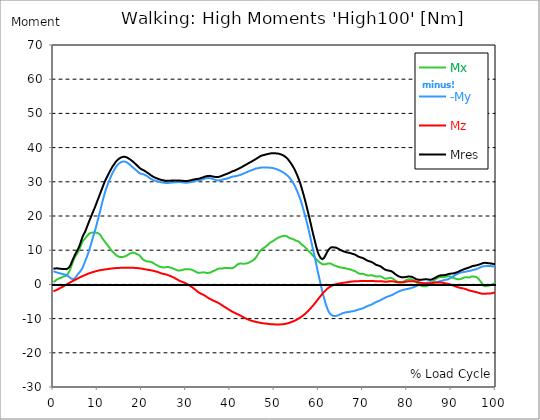
| Category |  Mx |  -My |  Mz |  Mres |
|---|---|---|---|---|
| 0.0 | 0.75 | 3.824 | -1.977 | 4.649 |
| 0.167348456675344 | 0.804 | 3.748 | -1.923 | 4.617 |
| 0.334696913350688 | 0.902 | 3.693 | -1.847 | 4.617 |
| 0.5020453700260321 | 1.097 | 3.617 | -1.76 | 4.66 |
| 0.669393826701376 | 1.325 | 3.541 | -1.662 | 4.704 |
| 0.83674228337672 | 1.423 | 3.465 | -1.564 | 4.671 |
| 1.0040907400520642 | 1.564 | 3.411 | -1.445 | 4.671 |
| 1.1621420602454444 | 1.684 | 3.346 | -1.325 | 4.66 |
| 1.3294905169207885 | 1.781 | 3.291 | -1.206 | 4.617 |
| 1.4968389735961325 | 1.858 | 3.248 | -1.097 | 4.595 |
| 1.6641874302714765 | 1.923 | 3.194 | -0.999 | 4.562 |
| 1.8315358869468206 | 1.988 | 3.128 | -0.891 | 4.53 |
| 1.9988843436221646 | 2.107 | 3.063 | -0.771 | 4.519 |
| 2.1662328002975086 | 2.216 | 3.009 | -0.663 | 4.53 |
| 2.333581256972853 | 2.335 | 2.944 | -0.532 | 4.53 |
| 2.5009297136481967 | 2.422 | 2.9 | -0.391 | 4.53 |
| 2.6682781703235405 | 2.433 | 2.868 | -0.272 | 4.486 |
| 2.8356266269988843 | 2.422 | 2.813 | -0.141 | 4.432 |
| 3.002975083674229 | 2.596 | 2.716 | -0.022 | 4.465 |
| 3.1703235403495724 | 2.889 | 2.585 | 0.098 | 4.628 |
| 3.337671997024917 | 3.172 | 2.422 | 0.239 | 4.736 |
| 3.4957233172182973 | 3.52 | 2.259 | 0.369 | 4.899 |
| 3.663071773893641 | 3.976 | 2.097 | 0.478 | 5.192 |
| 3.8304202305689854 | 4.497 | 1.955 | 0.597 | 5.562 |
| 3.997768687244329 | 5.073 | 1.771 | 0.706 | 6.029 |
| 4.165117143919673 | 5.681 | 1.553 | 0.815 | 6.507 |
| 4.332465600595017 | 6.311 | 1.51 | 0.945 | 7.061 |
| 4.499814057270361 | 6.887 | 1.51 | 1.065 | 7.571 |
| 4.667162513945706 | 7.354 | 1.619 | 1.184 | 8.028 |
| 4.834510970621049 | 7.843 | 1.727 | 1.282 | 8.506 |
| 5.001859427296393 | 8.256 | 1.977 | 1.401 | 8.94 |
| 5.169207883971737 | 8.614 | 2.259 | 1.51 | 9.342 |
| 5.336556340647081 | 8.918 | 2.596 | 1.619 | 9.722 |
| 5.503904797322425 | 9.288 | 2.922 | 1.727 | 10.135 |
| 5.671253253997769 | 9.668 | 3.205 | 1.836 | 10.569 |
| 5.82930457419115 | 10.124 | 3.422 | 1.944 | 11.069 |
| 5.996653030866494 | 10.624 | 3.672 | 2.064 | 11.634 |
| 6.164001487541838 | 11.167 | 3.954 | 2.173 | 12.275 |
| 6.331349944217181 | 11.732 | 4.236 | 2.281 | 12.916 |
| 6.498698400892526 | 12.275 | 4.595 | 2.368 | 13.557 |
| 6.66604685756787 | 12.688 | 5.062 | 2.466 | 14.111 |
| 6.833395314243213 | 12.927 | 5.616 | 2.564 | 14.567 |
| 7.000743770918558 | 13.144 | 6.159 | 2.651 | 14.969 |
| 7.168092227593902 | 13.339 | 6.702 | 2.737 | 15.36 |
| 7.335440684269246 | 13.687 | 7.224 | 2.835 | 15.914 |
| 7.50278914094459 | 13.959 | 7.789 | 2.922 | 16.457 |
| 7.6701375976199335 | 14.198 | 8.375 | 3.02 | 17.011 |
| 7.837486054295278 | 14.491 | 8.973 | 3.107 | 17.598 |
| 7.995537374488658 | 14.741 | 9.592 | 3.194 | 18.163 |
| 8.162885831164003 | 14.915 | 10.265 | 3.27 | 18.706 |
| 8.330234287839346 | 15.001 | 10.982 | 3.346 | 19.227 |
| 8.49758274451469 | 15.078 | 11.721 | 3.411 | 19.738 |
| 8.664931201190035 | 15.143 | 12.481 | 3.487 | 20.27 |
| 8.832279657865378 | 15.143 | 13.22 | 3.563 | 20.791 |
| 8.999628114540721 | 15.11 | 13.98 | 3.628 | 21.324 |
| 9.166976571216066 | 15.164 | 14.676 | 3.693 | 21.856 |
| 9.334325027891412 | 15.164 | 15.371 | 3.748 | 22.345 |
| 9.501673484566755 | 15.186 | 16.12 | 3.813 | 22.899 |
| 9.669021941242098 | 15.175 | 16.902 | 3.878 | 23.464 |
| 9.836370397917442 | 15.099 | 17.75 | 3.932 | 24.039 |
| 10.003718854592787 | 15.045 | 18.575 | 3.987 | 24.615 |
| 10.17106731126813 | 14.925 | 19.39 | 4.041 | 25.158 |
| 10.329118631461512 | 14.806 | 20.237 | 4.084 | 25.734 |
| 10.496467088136853 | 14.621 | 21.074 | 4.128 | 26.299 |
| 10.663815544812199 | 14.382 | 21.91 | 4.171 | 26.853 |
| 10.831164001487544 | 14.046 | 22.801 | 4.204 | 27.418 |
| 10.998512458162887 | 13.665 | 23.713 | 4.236 | 27.993 |
| 11.16586091483823 | 13.339 | 24.539 | 4.258 | 28.558 |
| 11.333209371513574 | 13.035 | 25.354 | 4.302 | 29.101 |
| 11.50055782818892 | 12.742 | 26.136 | 4.334 | 29.634 |
| 11.667906284864264 | 12.438 | 26.885 | 4.367 | 30.166 |
| 11.835254741539607 | 12.155 | 27.57 | 4.399 | 30.655 |
| 12.00260319821495 | 11.884 | 28.189 | 4.432 | 31.1 |
| 12.169951654890292 | 11.623 | 28.775 | 4.454 | 31.535 |
| 12.337300111565641 | 11.341 | 29.362 | 4.486 | 31.969 |
| 12.504648568240984 | 11.047 | 29.916 | 4.53 | 32.393 |
| 12.662699888434362 | 10.754 | 30.459 | 4.551 | 32.795 |
| 12.830048345109708 | 10.461 | 31.002 | 4.584 | 33.207 |
| 12.997396801785053 | 10.168 | 31.524 | 4.617 | 33.599 |
| 13.164745258460396 | 9.896 | 32.013 | 4.649 | 33.979 |
| 13.33209371513574 | 9.624 | 32.491 | 4.671 | 34.37 |
| 13.499442171811083 | 9.429 | 32.871 | 4.693 | 34.685 |
| 13.666790628486426 | 9.233 | 33.24 | 4.714 | 34.989 |
| 13.834139085161771 | 8.994 | 33.664 | 4.725 | 35.326 |
| 14.001487541837117 | 8.777 | 34.055 | 4.747 | 35.652 |
| 14.16883599851246 | 8.582 | 34.402 | 4.769 | 35.934 |
| 14.336184455187803 | 8.419 | 34.685 | 4.79 | 36.173 |
| 14.503532911863147 | 8.288 | 34.913 | 4.801 | 36.369 |
| 14.670881368538492 | 8.18 | 35.13 | 4.812 | 36.553 |
| 14.828932688731873 | 8.082 | 35.337 | 4.823 | 36.727 |
| 14.996281145407215 | 8.017 | 35.51 | 4.834 | 36.89 |
| 15.163629602082558 | 7.995 | 35.652 | 4.845 | 37.009 |
| 15.330978058757903 | 8.006 | 35.749 | 4.845 | 37.118 |
| 15.498326515433247 | 8.006 | 35.836 | 4.856 | 37.194 |
| 15.665674972108594 | 8.028 | 35.901 | 4.856 | 37.259 |
| 15.833023428783937 | 8.06 | 35.934 | 4.867 | 37.314 |
| 16.00037188545928 | 8.114 | 35.934 | 4.867 | 37.324 |
| 16.167720342134626 | 8.18 | 35.891 | 4.867 | 37.292 |
| 16.335068798809967 | 8.256 | 35.847 | 4.867 | 37.259 |
| 16.502417255485312 | 8.353 | 35.749 | 4.856 | 37.194 |
| 16.669765712160658 | 8.484 | 35.619 | 4.856 | 37.085 |
| 16.837114168836 | 8.625 | 35.467 | 4.867 | 36.977 |
| 17.004462625511344 | 8.766 | 35.304 | 4.867 | 36.846 |
| 17.16251394570472 | 8.897 | 35.152 | 4.867 | 36.727 |
| 17.32986240238007 | 9.038 | 34.946 | 4.867 | 36.564 |
| 17.497210859055414 | 9.125 | 34.75 | 4.867 | 36.39 |
| 17.664559315730756 | 9.201 | 34.554 | 4.867 | 36.227 |
| 17.8319077724061 | 9.288 | 34.37 | 4.856 | 36.064 |
| 17.999256229081443 | 9.32 | 34.196 | 4.856 | 35.912 |
| 18.166604685756788 | 9.266 | 34 | 4.845 | 35.717 |
| 18.333953142432133 | 9.212 | 33.783 | 4.834 | 35.489 |
| 18.501301599107478 | 9.103 | 33.609 | 4.812 | 35.282 |
| 18.668650055782823 | 9.016 | 33.468 | 4.79 | 35.119 |
| 18.835998512458165 | 8.918 | 33.262 | 4.78 | 34.902 |
| 19.00334696913351 | 8.81 | 33.066 | 4.758 | 34.674 |
| 19.170695425808855 | 8.723 | 32.86 | 4.747 | 34.457 |
| 19.338043882484197 | 8.625 | 32.664 | 4.736 | 34.25 |
| 19.496095202677576 | 8.44 | 32.501 | 4.704 | 34.044 |
| 19.66344365935292 | 8.201 | 32.393 | 4.671 | 33.881 |
| 19.830792116028263 | 7.952 | 32.349 | 4.638 | 33.751 |
| 19.998140572703612 | 7.637 | 32.306 | 4.595 | 33.609 |
| 20.165489029378953 | 7.354 | 32.273 | 4.573 | 33.501 |
| 20.3328374860543 | 7.191 | 32.23 | 4.53 | 33.414 |
| 20.500185942729644 | 7.083 | 32.143 | 4.486 | 33.294 |
| 20.667534399404985 | 6.974 | 32.045 | 4.432 | 33.175 |
| 20.83488285608033 | 6.865 | 31.926 | 4.389 | 33.034 |
| 21.002231312755672 | 6.767 | 31.817 | 4.356 | 32.892 |
| 21.16957976943102 | 6.702 | 31.687 | 4.302 | 32.751 |
| 21.336928226106362 | 6.691 | 31.524 | 4.269 | 32.599 |
| 21.504276682781704 | 6.702 | 31.361 | 4.247 | 32.436 |
| 21.67162513945705 | 6.67 | 31.241 | 4.226 | 32.306 |
| 21.82967645965043 | 6.648 | 31.067 | 4.193 | 32.132 |
| 21.997024916325774 | 6.605 | 30.915 | 4.139 | 31.969 |
| 22.16437337300112 | 6.539 | 30.763 | 4.095 | 31.806 |
| 22.33172182967646 | 6.463 | 30.655 | 4.063 | 31.676 |
| 22.499070286351806 | 6.322 | 30.535 | 4.019 | 31.524 |
| 22.666418743027148 | 6.192 | 30.448 | 3.965 | 31.415 |
| 22.833767199702496 | 6.051 | 30.361 | 3.9 | 31.296 |
| 23.00111565637784 | 5.877 | 30.318 | 3.835 | 31.209 |
| 23.168464113053183 | 5.736 | 30.275 | 3.769 | 31.122 |
| 23.335812569728528 | 5.649 | 30.209 | 3.715 | 31.046 |
| 23.50316102640387 | 5.54 | 30.144 | 3.672 | 30.948 |
| 23.670509483079215 | 5.431 | 30.09 | 3.606 | 30.872 |
| 23.83785793975456 | 5.312 | 30.036 | 3.53 | 30.785 |
| 23.995909259947936 | 5.203 | 29.992 | 3.433 | 30.72 |
| 24.163257716623285 | 5.116 | 29.949 | 3.335 | 30.655 |
| 24.330606173298627 | 5.073 | 29.883 | 3.248 | 30.568 |
| 24.49795462997397 | 5.029 | 29.829 | 3.172 | 30.513 |
| 24.665303086649313 | 4.986 | 29.797 | 3.118 | 30.459 |
| 24.83265154332466 | 4.964 | 29.764 | 3.096 | 30.427 |
| 25.0 | 4.953 | 29.753 | 3.052 | 30.405 |
| 25.167348456675345 | 4.986 | 29.71 | 2.998 | 30.361 |
| 25.334696913350694 | 5.019 | 29.644 | 2.955 | 30.318 |
| 25.502045370026035 | 5.051 | 29.634 | 2.9 | 30.307 |
| 25.669393826701377 | 5.095 | 29.634 | 2.835 | 30.307 |
| 25.836742283376722 | 5.105 | 29.655 | 2.759 | 30.329 |
| 26.004090740052067 | 5.084 | 29.666 | 2.672 | 30.318 |
| 26.17143919672741 | 5.029 | 29.699 | 2.596 | 30.34 |
| 26.329490516920792 | 4.975 | 29.71 | 2.52 | 30.329 |
| 26.49683897359613 | 4.921 | 29.731 | 2.433 | 30.34 |
| 26.66418743027148 | 4.845 | 29.753 | 2.335 | 30.351 |
| 26.831535886946828 | 4.758 | 29.786 | 2.238 | 30.361 |
| 26.998884343622166 | 4.682 | 29.807 | 2.14 | 30.361 |
| 27.166232800297514 | 4.617 | 29.829 | 2.042 | 30.372 |
| 27.333581256972852 | 4.519 | 29.862 | 1.934 | 30.372 |
| 27.5009297136482 | 4.432 | 29.883 | 1.814 | 30.372 |
| 27.668278170323543 | 4.313 | 29.873 | 1.684 | 30.351 |
| 27.835626626998888 | 4.204 | 29.873 | 1.553 | 30.34 |
| 28.002975083674233 | 4.128 | 29.883 | 1.434 | 30.34 |
| 28.170323540349575 | 4.074 | 29.916 | 1.314 | 30.361 |
| 28.33767199702492 | 4.03 | 29.938 | 1.195 | 30.372 |
| 28.50502045370026 | 4.019 | 29.938 | 1.086 | 30.361 |
| 28.663071773893645 | 4.052 | 29.927 | 0.978 | 30.351 |
| 28.830420230568986 | 4.117 | 29.894 | 0.88 | 30.329 |
| 28.99776868724433 | 4.182 | 29.862 | 0.793 | 30.318 |
| 29.165117143919673 | 4.247 | 29.84 | 0.717 | 30.296 |
| 29.33246560059502 | 4.302 | 29.807 | 0.641 | 30.275 |
| 29.499814057270367 | 4.356 | 29.775 | 0.554 | 30.253 |
| 29.66716251394571 | 4.399 | 29.753 | 0.467 | 30.242 |
| 29.834510970621054 | 4.432 | 29.742 | 0.38 | 30.231 |
| 30.00185942729639 | 4.454 | 29.731 | 0.272 | 30.22 |
| 30.169207883971744 | 4.443 | 29.742 | 0.163 | 30.231 |
| 30.33655634064708 | 4.432 | 29.764 | 0.043 | 30.253 |
| 30.50390479732243 | 4.421 | 29.786 | -0.098 | 30.275 |
| 30.671253253997772 | 4.432 | 29.818 | -0.228 | 30.318 |
| 30.829304574191156 | 4.41 | 29.862 | -0.358 | 30.372 |
| 30.996653030866494 | 4.389 | 29.916 | -0.489 | 30.427 |
| 31.164001487541842 | 4.313 | 29.959 | -0.641 | 30.47 |
| 31.331349944217187 | 4.236 | 30.036 | -0.782 | 30.524 |
| 31.498698400892525 | 4.15 | 30.101 | -0.945 | 30.59 |
| 31.666046857567874 | 4.063 | 30.166 | -1.108 | 30.644 |
| 31.833395314243212 | 3.965 | 30.22 | -1.271 | 30.698 |
| 32.00074377091856 | 3.867 | 30.253 | -1.445 | 30.72 |
| 32.1680922275939 | 3.759 | 30.307 | -1.619 | 30.774 |
| 32.33544068426925 | 3.585 | 30.361 | -1.792 | 30.839 |
| 32.50278914094459 | 3.476 | 30.361 | -1.977 | 30.85 |
| 32.670137597619934 | 3.433 | 30.34 | -2.162 | 30.85 |
| 32.83748605429528 | 3.4 | 30.34 | -2.314 | 30.85 |
| 33.004834510970625 | 3.411 | 30.394 | -2.455 | 30.915 |
| 33.162885831164004 | 3.411 | 30.492 | -2.574 | 31.013 |
| 33.33023428783935 | 3.443 | 30.568 | -2.694 | 31.089 |
| 33.497582744514695 | 3.465 | 30.611 | -2.803 | 31.144 |
| 33.664931201190036 | 3.498 | 30.666 | -2.9 | 31.209 |
| 33.83227965786538 | 3.53 | 30.731 | -3.009 | 31.274 |
| 33.99962811454073 | 3.53 | 30.829 | -3.107 | 31.372 |
| 34.16697657121607 | 3.487 | 30.926 | -3.226 | 31.469 |
| 34.33432502789141 | 3.433 | 31.002 | -3.357 | 31.545 |
| 34.50167348456676 | 3.389 | 31.057 | -3.487 | 31.6 |
| 34.6690219412421 | 3.367 | 31.067 | -3.65 | 31.643 |
| 34.83637039791744 | 3.378 | 31.078 | -3.791 | 31.665 |
| 35.00371885459279 | 3.367 | 31.089 | -3.932 | 31.698 |
| 35.17106731126814 | 3.367 | 31.089 | -4.063 | 31.708 |
| 35.338415767943474 | 3.389 | 31.1 | -4.193 | 31.741 |
| 35.49646708813686 | 3.454 | 31.057 | -4.313 | 31.719 |
| 35.6638155448122 | 3.563 | 30.981 | -4.41 | 31.665 |
| 35.831164001487544 | 3.693 | 30.905 | -4.508 | 31.611 |
| 35.998512458162885 | 3.824 | 30.818 | -4.606 | 31.545 |
| 36.165860914838234 | 3.889 | 30.763 | -4.704 | 31.524 |
| 36.333209371513576 | 3.954 | 30.709 | -4.812 | 31.491 |
| 36.50055782818892 | 4.074 | 30.611 | -4.91 | 31.426 |
| 36.667906284864266 | 4.182 | 30.535 | -5.029 | 31.393 |
| 36.83525474153961 | 4.313 | 30.481 | -5.138 | 31.383 |
| 37.002603198214956 | 4.443 | 30.427 | -5.225 | 31.383 |
| 37.1699516548903 | 4.541 | 30.405 | -5.323 | 31.404 |
| 37.337300111565646 | 4.606 | 30.394 | -5.442 | 31.426 |
| 37.50464856824098 | 4.628 | 30.416 | -5.573 | 31.48 |
| 37.66269988843437 | 4.617 | 30.448 | -5.703 | 31.535 |
| 37.83004834510971 | 4.638 | 30.492 | -5.833 | 31.6 |
| 37.99739680178505 | 4.628 | 30.557 | -5.964 | 31.687 |
| 38.16474525846039 | 4.638 | 30.633 | -6.105 | 31.795 |
| 38.33209371513574 | 4.693 | 30.687 | -6.257 | 31.882 |
| 38.49944217181109 | 4.758 | 30.72 | -6.398 | 31.958 |
| 38.666790628486424 | 4.79 | 30.774 | -6.539 | 32.045 |
| 38.83413908516178 | 4.79 | 30.839 | -6.67 | 32.132 |
| 39.001487541837115 | 4.801 | 30.883 | -6.8 | 32.208 |
| 39.16883599851246 | 4.823 | 30.915 | -6.952 | 32.273 |
| 39.336184455187805 | 4.834 | 30.981 | -7.093 | 32.36 |
| 39.503532911863154 | 4.823 | 31.057 | -7.224 | 32.458 |
| 39.670881368538495 | 4.812 | 31.122 | -7.354 | 32.556 |
| 39.83822982521384 | 4.812 | 31.176 | -7.495 | 32.643 |
| 39.996281145407224 | 4.758 | 31.285 | -7.626 | 32.751 |
| 40.163629602082565 | 4.704 | 31.383 | -7.756 | 32.871 |
| 40.33097805875791 | 4.704 | 31.469 | -7.876 | 32.979 |
| 40.498326515433256 | 4.747 | 31.524 | -7.995 | 33.077 |
| 40.6656749721086 | 4.856 | 31.545 | -8.114 | 33.142 |
| 40.83302342878393 | 4.964 | 31.578 | -8.212 | 33.218 |
| 41.00037188545929 | 5.116 | 31.6 | -8.332 | 33.283 |
| 41.16772034213463 | 5.279 | 31.632 | -8.44 | 33.36 |
| 41.33506879880997 | 5.486 | 31.687 | -8.538 | 33.479 |
| 41.50241725548531 | 5.703 | 31.73 | -8.625 | 33.588 |
| 41.66976571216066 | 5.877 | 31.784 | -8.723 | 33.696 |
| 41.837114168836 | 5.996 | 31.839 | -8.831 | 33.816 |
| 42.004462625511344 | 6.051 | 31.904 | -8.929 | 33.914 |
| 42.17181108218669 | 6.083 | 31.969 | -9.038 | 34.011 |
| 42.32986240238007 | 6.116 | 32.034 | -9.157 | 34.109 |
| 42.497210859055414 | 6.116 | 32.11 | -9.277 | 34.218 |
| 42.66455931573076 | 6.083 | 32.23 | -9.385 | 34.348 |
| 42.831907772406105 | 6.051 | 32.338 | -9.505 | 34.478 |
| 42.999256229081446 | 6.051 | 32.425 | -9.624 | 34.609 |
| 43.16660468575679 | 6.061 | 32.501 | -9.733 | 34.717 |
| 43.33395314243214 | 6.072 | 32.599 | -9.853 | 34.837 |
| 43.50130159910748 | 6.116 | 32.686 | -9.95 | 34.967 |
| 43.66865005578282 | 6.148 | 32.795 | -10.048 | 35.098 |
| 43.83599851245817 | 6.181 | 32.882 | -10.146 | 35.217 |
| 44.00334696913351 | 6.235 | 32.979 | -10.233 | 35.337 |
| 44.17069542580886 | 6.333 | 33.066 | -10.32 | 35.467 |
| 44.3380438824842 | 6.442 | 33.153 | -10.417 | 35.586 |
| 44.49609520267758 | 6.572 | 33.24 | -10.493 | 35.717 |
| 44.66344365935292 | 6.681 | 33.316 | -10.559 | 35.815 |
| 44.83079211602827 | 6.8 | 33.392 | -10.624 | 35.934 |
| 44.99814057270361 | 6.93 | 33.479 | -10.689 | 36.054 |
| 45.16548902937895 | 7.072 | 33.566 | -10.754 | 36.173 |
| 45.332837486054295 | 7.224 | 33.653 | -10.819 | 36.314 |
| 45.500185942729644 | 7.419 | 33.729 | -10.884 | 36.434 |
| 45.66753439940499 | 7.626 | 33.805 | -10.928 | 36.564 |
| 45.83488285608033 | 7.886 | 33.892 | -10.971 | 36.705 |
| 46.00223131275568 | 8.245 | 33.935 | -11.026 | 36.836 |
| 46.16957976943102 | 8.614 | 33.957 | -11.058 | 36.966 |
| 46.336928226106366 | 8.994 | 33.99 | -11.102 | 37.107 |
| 46.50427668278171 | 9.385 | 34.044 | -11.145 | 37.27 |
| 46.671625139457056 | 9.635 | 34.087 | -11.2 | 37.39 |
| 46.829676459650436 | 9.863 | 34.131 | -11.243 | 37.498 |
| 46.99702491632577 | 10.081 | 34.163 | -11.286 | 37.607 |
| 47.16437337300112 | 10.298 | 34.174 | -11.341 | 37.694 |
| 47.33172182967646 | 10.504 | 34.163 | -11.373 | 37.748 |
| 47.49907028635181 | 10.602 | 34.185 | -11.395 | 37.802 |
| 47.66641874302716 | 10.722 | 34.185 | -11.406 | 37.846 |
| 47.83376719970249 | 10.863 | 34.185 | -11.417 | 37.9 |
| 48.001115656377834 | 11.026 | 34.196 | -11.438 | 37.965 |
| 48.16846411305319 | 11.2 | 34.207 | -11.471 | 38.02 |
| 48.33581256972853 | 11.362 | 34.207 | -11.504 | 38.074 |
| 48.50316102640387 | 11.558 | 34.196 | -11.525 | 38.117 |
| 48.67050948307921 | 11.786 | 34.163 | -11.547 | 38.172 |
| 48.837857939754564 | 12.025 | 34.142 | -11.569 | 38.226 |
| 49.005206396429905 | 12.231 | 34.131 | -11.601 | 38.291 |
| 49.163257716623285 | 12.318 | 34.12 | -11.623 | 38.313 |
| 49.33060617329863 | 12.405 | 34.098 | -11.656 | 38.324 |
| 49.49795462997397 | 12.536 | 34.044 | -11.667 | 38.313 |
| 49.66530308664932 | 12.688 | 33.979 | -11.677 | 38.313 |
| 49.832651543324666 | 12.84 | 33.935 | -11.688 | 38.324 |
| 50.0 | 12.981 | 33.87 | -11.688 | 38.324 |
| 50.16734845667534 | 13.111 | 33.816 | -11.699 | 38.313 |
| 50.33469691335069 | 13.263 | 33.751 | -11.71 | 38.313 |
| 50.50204537002604 | 13.426 | 33.664 | -11.699 | 38.302 |
| 50.66939382670139 | 13.557 | 33.566 | -11.688 | 38.27 |
| 50.836742283376715 | 13.676 | 33.501 | -11.688 | 38.259 |
| 51.00409074005207 | 13.731 | 33.436 | -11.699 | 38.215 |
| 51.17143919672741 | 13.796 | 33.327 | -11.699 | 38.139 |
| 51.32949051692079 | 13.883 | 33.207 | -11.699 | 38.063 |
| 51.496838973596134 | 14.002 | 33.11 | -11.699 | 38.009 |
| 51.66418743027148 | 14.067 | 32.99 | -11.677 | 37.922 |
| 51.831535886946824 | 14.111 | 32.849 | -11.656 | 37.813 |
| 51.99888434362217 | 14.165 | 32.708 | -11.634 | 37.694 |
| 52.16623280029752 | 14.219 | 32.567 | -11.601 | 37.574 |
| 52.33358125697285 | 14.23 | 32.414 | -11.569 | 37.433 |
| 52.5009297136482 | 14.187 | 32.252 | -11.525 | 37.259 |
| 52.668278170323546 | 14.143 | 32.089 | -11.482 | 37.085 |
| 52.835626626998895 | 14.067 | 31.915 | -11.428 | 36.89 |
| 53.00297508367424 | 13.893 | 31.752 | -11.373 | 36.662 |
| 53.17032354034958 | 13.731 | 31.545 | -11.308 | 36.401 |
| 53.33767199702492 | 13.568 | 31.306 | -11.232 | 36.097 |
| 53.50502045370027 | 13.513 | 31.024 | -11.156 | 35.804 |
| 53.663071773893655 | 13.459 | 30.731 | -11.08 | 35.5 |
| 53.83042023056899 | 13.394 | 30.416 | -11.004 | 35.184 |
| 53.99776868724433 | 13.318 | 30.09 | -10.917 | 34.837 |
| 54.16511714391967 | 13.242 | 29.775 | -10.841 | 34.511 |
| 54.33246560059503 | 13.155 | 29.405 | -10.743 | 34.12 |
| 54.49981405727037 | 13.035 | 29.004 | -10.646 | 33.696 |
| 54.667162513945705 | 12.905 | 28.613 | -10.559 | 33.273 |
| 54.834510970621054 | 12.807 | 28.145 | -10.45 | 32.806 |
| 55.0018594272964 | 12.742 | 27.657 | -10.33 | 32.317 |
| 55.169207883971744 | 12.677 | 27.168 | -10.211 | 31.828 |
| 55.336556340647086 | 12.601 | 26.625 | -10.07 | 31.296 |
| 55.50390479732243 | 12.492 | 26.049 | -9.939 | 30.72 |
| 55.671253253997776 | 12.297 | 25.517 | -9.809 | 30.122 |
| 55.83860171067312 | 12.058 | 24.952 | -9.668 | 29.492 |
| 55.9966530308665 | 11.862 | 24.257 | -9.527 | 28.786 |
| 56.16400148754184 | 11.677 | 23.55 | -9.375 | 28.059 |
| 56.33134994421718 | 11.482 | 22.812 | -9.222 | 27.298 |
| 56.498698400892536 | 11.308 | 22.062 | -9.06 | 26.549 |
| 56.66604685756788 | 11.134 | 21.28 | -8.875 | 25.766 |
| 56.83339531424321 | 10.961 | 20.487 | -8.69 | 24.963 |
| 57.00074377091856 | 10.743 | 19.683 | -8.506 | 24.148 |
| 57.16809222759391 | 10.515 | 18.879 | -8.31 | 23.322 |
| 57.33544068426925 | 10.265 | 18.01 | -8.114 | 22.421 |
| 57.5027891409446 | 10.015 | 17.131 | -7.908 | 21.519 |
| 57.670137597619934 | 9.787 | 16.24 | -7.691 | 20.628 |
| 57.83748605429528 | 9.592 | 15.327 | -7.452 | 19.738 |
| 58.004834510970625 | 9.396 | 14.371 | -7.224 | 18.825 |
| 58.16288583116401 | 9.201 | 13.394 | -6.996 | 17.902 |
| 58.330234287839346 | 8.962 | 12.416 | -6.746 | 16.957 |
| 58.497582744514695 | 8.723 | 11.417 | -6.496 | 16.001 |
| 58.66493120119004 | 8.484 | 10.439 | -6.246 | 15.078 |
| 58.832279657865385 | 8.234 | 9.516 | -5.985 | 14.208 |
| 58.999628114540734 | 7.973 | 8.549 | -5.725 | 13.339 |
| 59.16697657121607 | 7.723 | 7.56 | -5.453 | 12.47 |
| 59.33432502789142 | 7.484 | 6.55 | -5.182 | 11.623 |
| 59.50167348456676 | 7.267 | 5.529 | -4.91 | 10.776 |
| 59.66902194124211 | 7.05 | 4.519 | -4.638 | 9.972 |
| 59.83637039791745 | 6.844 | 3.509 | -4.356 | 9.266 |
| 60.00371885459278 | 6.67 | 2.52 | -4.084 | 8.755 |
| 60.17106731126813 | 6.485 | 1.564 | -3.824 | 8.288 |
| 60.33841576794349 | 6.322 | 0.608 | -3.552 | 7.93 |
| 60.49646708813685 | 6.159 | -0.348 | -3.281 | 7.637 |
| 60.6638155448122 | 6.029 | -1.249 | -3.02 | 7.441 |
| 60.831164001487544 | 5.931 | -2.151 | -2.759 | 7.387 |
| 60.99851245816289 | 5.855 | -3.02 | -2.488 | 7.408 |
| 61.16586091483824 | 5.833 | -3.769 | -2.259 | 7.68 |
| 61.333209371513576 | 5.844 | -4.53 | -2.031 | 8.038 |
| 61.50055782818892 | 5.877 | -5.268 | -1.814 | 8.419 |
| 61.667906284864266 | 5.92 | -5.996 | -1.586 | 8.842 |
| 61.835254741539615 | 6.007 | -6.648 | -1.39 | 9.266 |
| 62.002603198214956 | 6.105 | -7.245 | -1.206 | 9.69 |
| 62.16995165489029 | 6.137 | -7.734 | -1.032 | 10.015 |
| 62.33730011156564 | 6.148 | -8.125 | -0.891 | 10.309 |
| 62.504648568240995 | 6.148 | -8.462 | -0.76 | 10.559 |
| 62.67199702491633 | 6.094 | -8.712 | -0.63 | 10.722 |
| 62.83004834510971 | 6.018 | -8.907 | -0.511 | 10.83 |
| 62.99739680178505 | 5.898 | -9.07 | -0.391 | 10.884 |
| 63.1647452584604 | 5.768 | -9.136 | -0.282 | 10.863 |
| 63.33209371513575 | 5.638 | -9.19 | -0.185 | 10.83 |
| 63.4994421718111 | 5.54 | -9.222 | -0.109 | 10.808 |
| 63.666790628486424 | 5.475 | -9.244 | -0.043 | 10.787 |
| 63.83413908516177 | 5.41 | -9.233 | 0.022 | 10.754 |
| 64.00148754183712 | 5.366 | -9.222 | 0.087 | 10.711 |
| 64.16883599851248 | 5.268 | -9.157 | 0.152 | 10.602 |
| 64.3361844551878 | 5.203 | -9.07 | 0.196 | 10.493 |
| 64.50353291186315 | 5.084 | -8.962 | 0.239 | 10.341 |
| 64.6708813685385 | 5.04 | -8.853 | 0.282 | 10.222 |
| 64.83822982521384 | 4.986 | -8.755 | 0.326 | 10.113 |
| 65.00557828188919 | 4.953 | -8.658 | 0.348 | 10.015 |
| 65.16362960208257 | 4.91 | -8.571 | 0.38 | 9.907 |
| 65.3309780587579 | 4.867 | -8.484 | 0.413 | 9.809 |
| 65.49832651543326 | 4.823 | -8.386 | 0.456 | 9.711 |
| 65.6656749721086 | 4.812 | -8.332 | 0.489 | 9.646 |
| 65.83302342878395 | 4.78 | -8.267 | 0.521 | 9.581 |
| 66.00037188545929 | 4.725 | -8.201 | 0.554 | 9.494 |
| 66.16772034213463 | 4.649 | -8.147 | 0.587 | 9.418 |
| 66.33506879880998 | 4.595 | -8.114 | 0.619 | 9.364 |
| 66.50241725548531 | 4.551 | -8.093 | 0.641 | 9.331 |
| 66.66976571216065 | 4.508 | -8.06 | 0.673 | 9.288 |
| 66.83711416883601 | 4.465 | -8.049 | 0.706 | 9.255 |
| 67.00446262551135 | 4.421 | -8.017 | 0.75 | 9.212 |
| 67.1718110821867 | 4.356 | -7.973 | 0.782 | 9.136 |
| 67.32986240238007 | 4.28 | -7.919 | 0.815 | 9.06 |
| 67.49721085905541 | 4.204 | -7.876 | 0.847 | 8.984 |
| 67.66455931573076 | 4.106 | -7.843 | 0.858 | 8.918 |
| 67.83190777240611 | 4.03 | -7.81 | 0.88 | 8.864 |
| 67.99925622908145 | 3.965 | -7.778 | 0.902 | 8.81 |
| 68.16660468575678 | 3.9 | -7.713 | 0.912 | 8.723 |
| 68.33395314243214 | 3.813 | -7.647 | 0.923 | 8.636 |
| 68.50130159910749 | 3.661 | -7.571 | 0.934 | 8.495 |
| 68.66865005578282 | 3.498 | -7.495 | 0.934 | 8.353 |
| 68.83599851245816 | 3.346 | -7.419 | 0.934 | 8.212 |
| 69.00334696913352 | 3.226 | -7.365 | 0.945 | 8.114 |
| 69.17069542580886 | 3.15 | -7.3 | 0.956 | 8.028 |
| 69.3380438824842 | 3.096 | -7.245 | 0.967 | 7.962 |
| 69.50539233915956 | 3.063 | -7.18 | 0.978 | 7.886 |
| 69.66344365935292 | 3.074 | -7.115 | 0.989 | 7.832 |
| 69.83079211602826 | 3.107 | -7.05 | 1.01 | 7.778 |
| 69.99814057270362 | 3.096 | -6.974 | 1.021 | 7.702 |
| 70.16548902937896 | 3.042 | -6.887 | 1.032 | 7.604 |
| 70.33283748605429 | 2.955 | -6.778 | 1.021 | 7.474 |
| 70.50018594272964 | 2.857 | -6.659 | 1.01 | 7.332 |
| 70.667534399405 | 2.759 | -6.55 | 0.989 | 7.191 |
| 70.83488285608033 | 2.683 | -6.442 | 0.978 | 7.061 |
| 71.00223131275568 | 2.629 | -6.344 | 0.967 | 6.963 |
| 71.16957976943102 | 2.607 | -6.257 | 0.967 | 6.876 |
| 71.33692822610637 | 2.607 | -6.181 | 0.978 | 6.8 |
| 71.50427668278171 | 2.629 | -6.105 | 0.989 | 6.735 |
| 71.67162513945706 | 2.661 | -6.018 | 0.999 | 6.681 |
| 71.8389735961324 | 2.683 | -5.942 | 1.01 | 6.615 |
| 71.99702491632577 | 2.672 | -5.844 | 1.021 | 6.529 |
| 72.16437337300113 | 2.64 | -5.746 | 1.01 | 6.42 |
| 72.33172182967647 | 2.564 | -5.616 | 0.989 | 6.279 |
| 72.49907028635181 | 2.477 | -5.486 | 0.967 | 6.127 |
| 72.66641874302715 | 2.412 | -5.366 | 0.945 | 5.975 |
| 72.8337671997025 | 2.335 | -5.236 | 0.923 | 5.833 |
| 73.00111565637783 | 2.281 | -5.127 | 0.912 | 5.703 |
| 73.16846411305319 | 2.292 | -5.04 | 0.923 | 5.627 |
| 73.33581256972853 | 2.314 | -4.953 | 0.934 | 5.573 |
| 73.50316102640387 | 2.346 | -4.867 | 0.945 | 5.507 |
| 73.67050948307921 | 2.39 | -4.78 | 0.956 | 5.442 |
| 73.83785793975457 | 2.401 | -4.693 | 0.967 | 5.377 |
| 74.00520639642991 | 2.346 | -4.595 | 0.956 | 5.258 |
| 74.16325771662328 | 2.249 | -4.475 | 0.934 | 5.116 |
| 74.33060617329863 | 2.129 | -4.356 | 0.912 | 4.943 |
| 74.49795462997398 | 2.01 | -4.226 | 0.88 | 4.78 |
| 74.66530308664932 | 1.868 | -4.106 | 0.847 | 4.606 |
| 74.83265154332466 | 1.749 | -3.987 | 0.815 | 4.443 |
| 75.00000000000001 | 1.695 | -3.878 | 0.793 | 4.323 |
| 75.16734845667534 | 1.673 | -3.791 | 0.793 | 4.236 |
| 75.3346969133507 | 1.695 | -3.704 | 0.804 | 4.171 |
| 75.50204537002605 | 1.727 | -3.617 | 0.815 | 4.106 |
| 75.66939382670138 | 1.749 | -3.53 | 0.836 | 4.052 |
| 75.83674228337672 | 1.803 | -3.454 | 0.869 | 4.019 |
| 76.00409074005208 | 1.89 | -3.378 | 0.902 | 4.008 |
| 76.17143919672742 | 1.934 | -3.302 | 0.923 | 3.965 |
| 76.33878765340276 | 1.923 | -3.226 | 0.923 | 3.9 |
| 76.49683897359614 | 1.858 | -3.15 | 0.912 | 3.813 |
| 76.66418743027148 | 1.749 | -3.052 | 0.902 | 3.672 |
| 76.83153588694682 | 1.629 | -2.922 | 0.88 | 3.509 |
| 76.99888434362218 | 1.466 | -2.803 | 0.847 | 3.324 |
| 77.16623280029752 | 1.304 | -2.694 | 0.804 | 3.161 |
| 77.33358125697285 | 1.13 | -2.574 | 0.76 | 2.976 |
| 77.5009297136482 | 0.989 | -2.455 | 0.728 | 2.813 |
| 77.66827817032356 | 0.869 | -2.346 | 0.695 | 2.683 |
| 77.83562662699889 | 0.75 | -2.227 | 0.663 | 2.542 |
| 78.00297508367423 | 0.63 | -2.118 | 0.63 | 2.401 |
| 78.17032354034959 | 0.565 | -2.02 | 0.608 | 2.303 |
| 78.33767199702493 | 0.576 | -1.934 | 0.608 | 2.238 |
| 78.50502045370027 | 0.576 | -1.858 | 0.608 | 2.173 |
| 78.67236891037561 | 0.587 | -1.781 | 0.608 | 2.107 |
| 78.83042023056899 | 0.619 | -1.716 | 0.619 | 2.064 |
| 78.99776868724433 | 0.695 | -1.651 | 0.641 | 2.053 |
| 79.16511714391969 | 0.793 | -1.586 | 0.673 | 2.075 |
| 79.33246560059503 | 0.902 | -1.532 | 0.706 | 2.097 |
| 79.49981405727036 | 1.043 | -1.477 | 0.739 | 2.129 |
| 79.66716251394571 | 1.184 | -1.434 | 0.782 | 2.173 |
| 79.83451097062107 | 1.282 | -1.401 | 0.815 | 2.216 |
| 80.00185942729641 | 1.369 | -1.358 | 0.858 | 2.259 |
| 80.16920788397174 | 1.423 | -1.304 | 0.88 | 2.27 |
| 80.33655634064709 | 1.456 | -1.249 | 0.902 | 2.281 |
| 80.50390479732243 | 1.488 | -1.206 | 0.923 | 2.292 |
| 80.67125325399778 | 1.499 | -1.141 | 0.934 | 2.281 |
| 80.83860171067312 | 1.51 | -1.097 | 0.945 | 2.281 |
| 80.99665303086651 | 1.477 | -1.021 | 0.945 | 2.238 |
| 81.16400148754184 | 1.412 | -0.956 | 0.934 | 2.162 |
| 81.3313499442172 | 1.293 | -0.88 | 0.923 | 2.064 |
| 81.49869840089255 | 1.173 | -0.804 | 0.902 | 1.944 |
| 81.66604685756786 | 1.032 | -0.717 | 0.88 | 1.825 |
| 81.83339531424322 | 0.891 | -0.641 | 0.847 | 1.695 |
| 82.00074377091858 | 0.717 | -0.543 | 0.815 | 1.553 |
| 82.16809222759392 | 0.554 | -0.445 | 0.771 | 1.466 |
| 82.33544068426926 | 0.38 | -0.348 | 0.717 | 1.423 |
| 82.50278914094459 | 0.206 | -0.261 | 0.673 | 1.38 |
| 82.67013759761994 | 0.043 | -0.163 | 0.619 | 1.358 |
| 82.83748605429528 | -0.109 | -0.076 | 0.576 | 1.347 |
| 83.00483451097062 | -0.25 | 0 | 0.511 | 1.358 |
| 83.17218296764597 | -0.402 | 0.087 | 0.456 | 1.38 |
| 83.33023428783935 | -0.478 | 0.152 | 0.413 | 1.39 |
| 83.4975827445147 | -0.532 | 0.206 | 0.38 | 1.412 |
| 83.66493120119004 | -0.554 | 0.261 | 0.337 | 1.434 |
| 83.83227965786537 | -0.565 | 0.315 | 0.315 | 1.456 |
| 83.99962811454073 | -0.554 | 0.358 | 0.293 | 1.477 |
| 84.16697657121607 | -0.532 | 0.391 | 0.282 | 1.488 |
| 84.33432502789142 | -0.489 | 0.435 | 0.272 | 1.488 |
| 84.50167348456677 | -0.424 | 0.478 | 0.272 | 1.466 |
| 84.6690219412421 | -0.315 | 0.521 | 0.272 | 1.445 |
| 84.83637039791745 | -0.196 | 0.554 | 0.272 | 1.434 |
| 85.0037188545928 | -0.033 | 0.565 | 0.282 | 1.39 |
| 85.17106731126813 | 0.141 | 0.587 | 0.304 | 1.358 |
| 85.33841576794349 | 0.337 | 0.597 | 0.326 | 1.369 |
| 85.50576422461883 | 0.511 | 0.608 | 0.358 | 1.39 |
| 85.66381554481221 | 0.706 | 0.619 | 0.38 | 1.488 |
| 85.83116400148755 | 0.912 | 0.63 | 0.424 | 1.597 |
| 85.99851245816289 | 1.097 | 0.63 | 0.456 | 1.705 |
| 86.16586091483823 | 1.282 | 0.641 | 0.489 | 1.825 |
| 86.33320937151358 | 1.423 | 0.663 | 0.521 | 1.934 |
| 86.50055782818893 | 1.564 | 0.684 | 0.543 | 2.053 |
| 86.66790628486427 | 1.716 | 0.706 | 0.565 | 2.194 |
| 86.83525474153961 | 1.858 | 0.739 | 0.587 | 2.314 |
| 87.00260319821496 | 1.955 | 0.782 | 0.587 | 2.412 |
| 87.16995165489031 | 2.042 | 0.836 | 0.587 | 2.498 |
| 87.33730011156564 | 2.107 | 0.891 | 0.587 | 2.564 |
| 87.504648568241 | 2.151 | 0.945 | 0.576 | 2.618 |
| 87.67199702491634 | 2.183 | 0.999 | 0.554 | 2.661 |
| 87.83004834510972 | 2.183 | 1.075 | 0.521 | 2.683 |
| 87.99739680178506 | 2.173 | 1.13 | 0.478 | 2.694 |
| 88.1647452584604 | 2.151 | 1.195 | 0.445 | 2.694 |
| 88.33209371513574 | 2.162 | 1.249 | 0.391 | 2.716 |
| 88.49944217181108 | 2.205 | 1.282 | 0.348 | 2.727 |
| 88.66679062848644 | 2.227 | 1.325 | 0.293 | 2.737 |
| 88.83413908516178 | 2.281 | 1.38 | 0.25 | 2.792 |
| 89.00148754183712 | 2.368 | 1.412 | 0.206 | 2.889 |
| 89.16883599851246 | 2.401 | 1.477 | 0.163 | 2.966 |
| 89.33618445518782 | 2.422 | 1.553 | 0.119 | 3.031 |
| 89.50353291186315 | 2.401 | 1.662 | 0.076 | 3.085 |
| 89.6708813685385 | 2.335 | 1.781 | 0.022 | 3.118 |
| 89.83822982521386 | 2.249 | 1.901 | -0.054 | 3.139 |
| 90.00557828188919 | 2.162 | 2.031 | -0.13 | 3.161 |
| 90.16362960208257 | 2.053 | 2.151 | -0.217 | 3.172 |
| 90.3309780587579 | 1.966 | 2.292 | -0.304 | 3.194 |
| 90.49832651543326 | 1.879 | 2.422 | -0.391 | 3.237 |
| 90.66567497210859 | 1.803 | 2.553 | -0.467 | 3.281 |
| 90.83302342878395 | 1.727 | 2.694 | -0.543 | 3.357 |
| 91.00037188545929 | 1.651 | 2.813 | -0.619 | 3.422 |
| 91.16772034213463 | 1.586 | 2.933 | -0.695 | 3.487 |
| 91.33506879880998 | 1.532 | 3.042 | -0.771 | 3.574 |
| 91.50241725548533 | 1.499 | 3.15 | -0.836 | 3.672 |
| 91.66976571216065 | 1.477 | 3.259 | -0.902 | 3.78 |
| 91.83711416883601 | 1.499 | 3.357 | -0.967 | 3.889 |
| 92.00446262551137 | 1.543 | 3.422 | -1.021 | 3.987 |
| 92.1718110821867 | 1.608 | 3.465 | -1.075 | 4.074 |
| 92.33915953886203 | 1.684 | 3.52 | -1.108 | 4.16 |
| 92.49721085905541 | 1.803 | 3.563 | -1.141 | 4.258 |
| 92.66455931573077 | 1.923 | 3.596 | -1.173 | 4.356 |
| 92.83190777240611 | 1.999 | 3.628 | -1.217 | 4.432 |
| 92.99925622908145 | 2.042 | 3.672 | -1.271 | 4.519 |
| 93.1666046857568 | 2.075 | 3.704 | -1.347 | 4.584 |
| 93.33395314243214 | 2.086 | 3.737 | -1.412 | 4.649 |
| 93.50130159910749 | 2.107 | 3.78 | -1.499 | 4.714 |
| 93.66865005578283 | 2.064 | 3.845 | -1.597 | 4.79 |
| 93.83599851245818 | 1.988 | 3.921 | -1.684 | 4.877 |
| 94.00334696913353 | 1.966 | 3.976 | -1.771 | 4.953 |
| 94.17069542580886 | 2.064 | 3.987 | -1.836 | 5.019 |
| 94.3380438824842 | 2.194 | 4.019 | -1.868 | 5.116 |
| 94.50539233915954 | 2.325 | 4.041 | -1.901 | 5.203 |
| 94.66344365935292 | 2.368 | 4.106 | -1.966 | 5.301 |
| 94.83079211602828 | 2.325 | 4.182 | -2.02 | 5.366 |
| 94.99814057270362 | 2.292 | 4.247 | -2.097 | 5.431 |
| 95.16548902937897 | 2.259 | 4.313 | -2.14 | 5.464 |
| 95.33283748605432 | 2.238 | 4.356 | -2.183 | 5.497 |
| 95.50018594272963 | 2.216 | 4.389 | -2.216 | 5.518 |
| 95.66753439940499 | 2.129 | 4.465 | -2.27 | 5.573 |
| 95.83488285608034 | 1.955 | 4.551 | -2.325 | 5.627 |
| 96.00223131275567 | 1.76 | 4.66 | -2.39 | 5.692 |
| 96.16957976943102 | 1.553 | 4.769 | -2.455 | 5.757 |
| 96.33692822610638 | 1.304 | 4.877 | -2.52 | 5.833 |
| 96.50427668278171 | 1.032 | 4.975 | -2.585 | 5.92 |
| 96.67162513945706 | 0.739 | 5.084 | -2.64 | 5.985 |
| 96.8389735961324 | 0.435 | 5.16 | -2.694 | 6.072 |
| 96.99702491632577 | 0.119 | 5.225 | -2.727 | 6.17 |
| 97.16437337300111 | -0.163 | 5.268 | -2.748 | 6.235 |
| 97.33172182967647 | -0.424 | 5.301 | -2.759 | 6.29 |
| 97.49907028635181 | -0.608 | 5.334 | -2.759 | 6.322 |
| 97.66641874302715 | -0.554 | 5.344 | -2.727 | 6.3 |
| 97.8337671997025 | -0.511 | 5.355 | -2.705 | 6.279 |
| 98.00111565637785 | -0.445 | 5.377 | -2.694 | 6.246 |
| 98.16846411305319 | -0.369 | 5.388 | -2.672 | 6.224 |
| 98.33581256972855 | -0.38 | 5.388 | -2.661 | 6.203 |
| 98.50316102640389 | -0.315 | 5.388 | -2.651 | 6.181 |
| 98.67050948307921 | -0.272 | 5.377 | -2.651 | 6.159 |
| 98.83785793975456 | -0.217 | 5.366 | -2.651 | 6.137 |
| 99.0052063964299 | -0.152 | 5.344 | -2.618 | 6.116 |
| 99.17255485310525 | -0.033 | 5.312 | -2.574 | 6.061 |
| 99.33060617329863 | 0.109 | 5.268 | -2.509 | 6.007 |
| 99.49795462997399 | 0.206 | 5.225 | -2.466 | 5.964 |
| 99.66530308664933 | 0.261 | 5.192 | -2.422 | 5.931 |
| 99.83265154332467 | 0.293 | 5.16 | -2.39 | 5.888 |
| 100.0 | 0.326 | 5.127 | -2.357 | 5.855 |